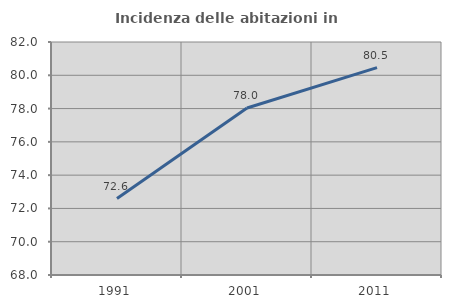
| Category | Incidenza delle abitazioni in proprietà  |
|---|---|
| 1991.0 | 72.596 |
| 2001.0 | 78.034 |
| 2011.0 | 80.46 |